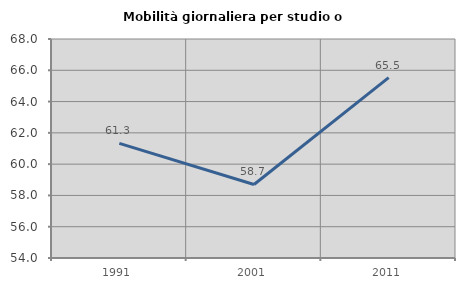
| Category | Mobilità giornaliera per studio o lavoro |
|---|---|
| 1991.0 | 61.331 |
| 2001.0 | 58.7 |
| 2011.0 | 65.53 |